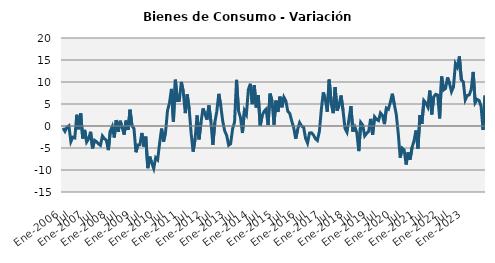
| Category | Series 0 |
|---|---|
| Ene-2006 | -0.464 |
|  | -1.206 |
|  | -0.268 |
|  | 0.05 |
|  | -3.563 |
|  | -2.557 |
| Jul | -2.703 |
|  | 2.558 |
|  | -0.743 |
|  | 2.887 |
|  | -2.829 |
|  | -0.881 |
| Ene-2007 | -3.645 |
|  | -2.914 |
|  | -1.314 |
|  | -5.081 |
|  | -3.25 |
|  | -3.566 |
| Jul | -4.061 |
|  | -4.389 |
|  | -2.261 |
|  | -2.876 |
|  | -3.225 |
|  | -5.482 |
| Ene-2008 | -1.135 |
|  | -0.105 |
|  | -2.612 |
|  | 1.356 |
|  | -1.328 |
|  | 1.19 |
| Jul | -0.301 |
|  | -1.954 |
|  | 1.225 |
|  | -0.886 |
|  | 3.699 |
|  | 0.022 |
| Ene-2009 | -0.585 |
|  | -5.964 |
|  | -4.294 |
|  | -4.277 |
|  | -1.58 |
|  | -4.653 |
| Jul | -2.412 |
|  | -9.589 |
|  | -6.952 |
|  | -8.423 |
|  | -9.658 |
|  | -7.195 |
| Ene-2010 | -7.671 |
|  | -3.899 |
|  | -0.585 |
|  | -3.554 |
|  | -1.422 |
|  | 3.512 |
| Jul | 5.221 |
|  | 8.421 |
|  | 0.996 |
|  | 10.517 |
|  | 5.779 |
|  | 5.807 |
| Ene-2011 | 10.019 |
|  | 7.775 |
|  | 2.926 |
|  | 7.2 |
|  | 3.778 |
|  | -1.752 |
| Jul | -5.822 |
|  | -2.849 |
|  | 2.395 |
|  | -3.038 |
|  | 0.874 |
|  | 3.997 |
| Ene-2012 | 2.717 |
|  | 1.458 |
|  | 4.669 |
|  | 1.073 |
|  | -4.287 |
|  | 0.801 |
| Jul | 3.364 |
|  | 7.316 |
|  | 4.615 |
|  | 1.093 |
|  | -1.111 |
|  | -2.138 |
| Ene-2013 | -4.361 |
|  | -4.042 |
|  | -0.664 |
|  | 0.913 |
|  | 10.487 |
|  | 3.45 |
| Jul | 1.946 |
|  | -1.592 |
|  | 3.485 |
|  | 2.604 |
|  | 8.278 |
|  | 9.595 |
| Ene-2014 | 4.967 |
|  | 9.256 |
|  | 4.197 |
|  | 7.001 |
|  | 0.019 |
|  | 2.394 |
| Jul | 3.34 |
|  | 3.824 |
|  | 0.232 |
|  | 7.354 |
|  | 5.724 |
|  | 0.289 |
| Ene-2015 | 5.763 |
|  | 3.19 |
|  | 6.671 |
|  | 4.255 |
|  | 6.551 |
|  | 5.716 |
| Jul | 3.345 |
|  | 2.85 |
|  | 1.116 |
|  | -0.379 |
|  | -2.911 |
|  | -0.763 |
| Ene-2016 | 0.76 |
|  | -0.015 |
|  | -0.24 |
|  | -2.77 |
|  | -3.872 |
|  | -1.598 |
| Jul | -1.53 |
|  | -2.033 |
|  | -2.882 |
|  | -3.282 |
|  | -1.251 |
|  | 3.724 |
| Ene-2017 | 7.635 |
|  | 6.097 |
|  | 3.237 |
|  | 10.549 |
|  | 5.23 |
|  | 2.918 |
| Jul | 8.829 |
|  | 3.472 |
|  | 4.75 |
|  | 6.933 |
|  | 3.559 |
|  | -0.567 |
| Ene-2018 | -1.42 |
|  | 1.467 |
|  | 4.528 |
|  | -1.267 |
|  | -0.239 |
|  | -1.581 |
| Jul | -5.706 |
|  | 0.809 |
|  | 0.19 |
|  | -2.25 |
|  | -1.677 |
|  | -1.197 |
| Ene-2019 | 1.617 |
|  | -2.008 |
|  | 2.077 |
|  | 1.493 |
|  | 1.23 |
|  | 2.954 |
| Jul | 2.418 |
|  | 0.426 |
|  | 4.088 |
|  | 3.806 |
|  | 5.383 |
|  | 7.334 |
| Ene-2020 | 4.937 |
|  | 2.629 |
|  | -1.687 |
|  | -7.195 |
|  | -5.043 |
|  | -5.447 |
| Jul | -8.752 |
|  | -6.002 |
|  | -7.65 |
|  | -4.864 |
|  | -3.36 |
|  | -1.025 |
| Ene-2021 | -5.136 |
|  | 2.47 |
|  | 0.476 |
|  | 5.785 |
|  | 5.224 |
|  | 4.322 |
| Jul | 8.054 |
|  | 2.631 |
|  | 6.656 |
|  | 7.2 |
|  | 7.035 |
|  | 1.724 |
| Ene-2022 | 11.251 |
|  | 8.19 |
|  | 8.536 |
|  | 11.038 |
|  | 9.667 |
|  | 7.806 |
| Jul | 8.875 |
|  | 14.165 |
|  | 13.342 |
|  | 15.81 |
|  | 10.511 |
|  | 10.028 |
| Ene-2023 | 5.943 |